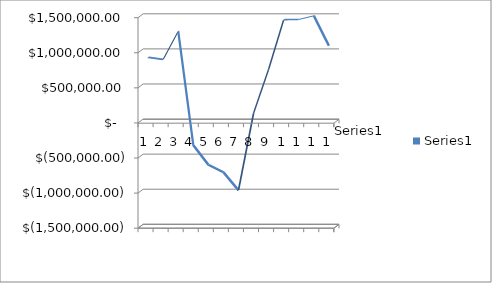
| Category | Series 0 |
|---|---|
| 0 | 893844.45 |
| 1 | 863466.75 |
| 2 | 1265501.09 |
| 3 | -358523.18 |
| 4 | -638362.92 |
| 5 | -744979.9 |
| 6 | -1002096.8 |
| 7 | 95081.59 |
| 8 | 722890.32 |
| 9 | 1430244.68 |
| 10 | 1433136.05 |
| 11 | 1485045.26 |
| 12 | 1059279.38 |